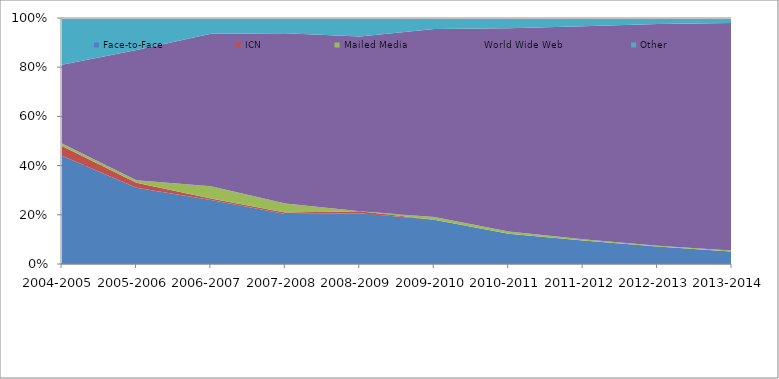
| Category | Face-to-Face  | ICN | Mailed Media | World Wide Web | Other |
|---|---|---|---|---|---|
| 2004-2005 | 0.44 | 0.04 | 0.01 | 0.32 | 0.19 |
| 2005-2006 | 0.31 | 0.02 | 0.01 | 0.53 | 0.13 |
| 2006-2007 | 0.26 | 0.006 | 0.05 | 0.62 | 0.064 |
| 2007-2008 | 0.203 | 0.006 | 0.037 | 0.692 | 0.062 |
| 2008-2009 | 0.206 | 0.008 | 0 | 0.711 | 0.075 |
| 2009-2010 | 0.18 | 0 | 0.011 | 0.764 | 0.045 |
| 2010-2011 | 0.123 | 0 | 0.009 | 0.826 | 0.042 |
| 2011-2012 | 0.096 | 0 | 0.005 | 0.865 | 0.034 |
| 2012-2013 | 0.071 | 0 | 0.003 | 0.902 | 0.025 |
| 2013-2014 | 0.051 | 0 | 0.004 | 0.925 | 0.02 |